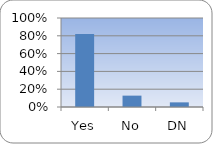
| Category | Series 0 |
|---|---|
| Yes | 0.82 |
| No | 0.128 |
| DN | 0.052 |